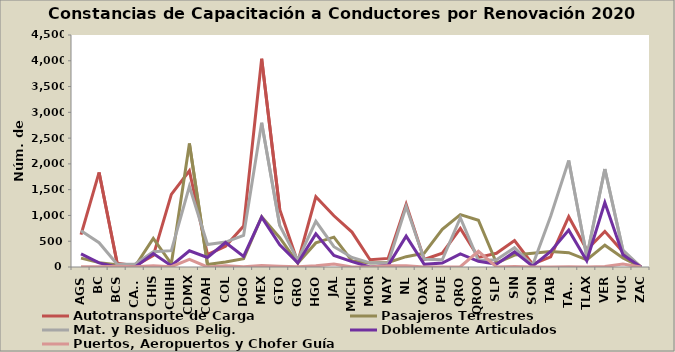
| Category | Autotransporte de Carga | Pasajeros Terrestres | Mat. y Residuos Pelig. | Doblemente Articulados | Puertos, Aeropuertos y Chofer Guía |
|---|---|---|---|---|---|
| AGS | 629 | 172 | 703 | 256 | 6 |
| BC | 1834 | 85 | 472 | 79 | 6 |
| BCS | 74 | 43 | 55 | 0 | 13 |
| CAMP | 23 | 20 | 59 | 0 | 7 |
| CHIS | 221 | 556 | 296 | 262 | 22 |
| CHIH | 1409 | 63 | 317 | 25 | 5 |
| CDMX | 1866 | 2397 | 1565 | 315 | 148 |
| COAH | 241 | 48 | 436 | 184 | 0 |
| COL | 403 | 99 | 483 | 475 | 23 |
| DGO | 794 | 161 | 612 | 206 | 4 |
| MEX | 4040 | 976 | 2796 | 967 | 29 |
| GTO | 1116 | 569 | 806 | 429 | 16 |
| GRO | 93 | 75 | 132 | 79 | 7 |
| HGO | 1362 | 467 | 886 | 643 | 23 |
| JAL | 994 | 579 | 393 | 225 | 56 |
| MICH | 677 | 118 | 185 | 104 | 2 |
| MOR | 141 | 79 | 81 | 0 | 0 |
| NAY | 167 | 89 | 75 | 30 | 26 |
| NL | 1218 | 200 | 1172 | 598 | 23 |
| OAX | 145 | 268 | 148 | 52 | 2 |
| PUE | 268 | 729 | 141 | 78 | 1 |
| QRO | 748 | 1016 | 956 | 254 | 5 |
| QROO | 186 | 907 | 129 | 111 | 304 |
| SLP | 265 | 76 | 140 | 53 | 1 |
| SIN | 513 | 232 | 375 | 293 | 8 |
| SON | 54 | 265 | 33 | 17 | 0 |
| TAB | 196 | 300 | 986 | 302 | 2 |
| TAMS | 976 | 277 | 2066 | 715 | 7 |
| TLAX | 335 | 139 | 200 | 121 | 0 |
| VER | 691 | 423 | 1900 | 1249 | 11 |
| YUC | 294 | 176 | 327 | 239 | 59 |
| ZAC | 0 | 0 | 0 | 0 | 0 |